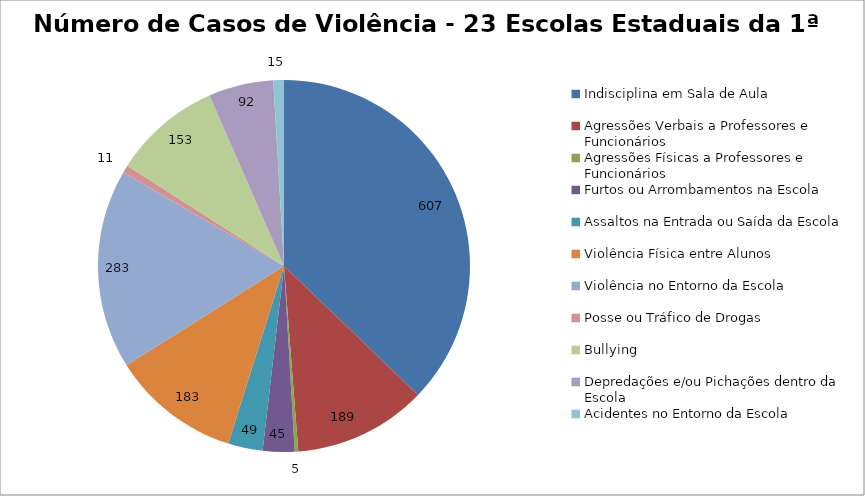
| Category | Número de Casos |
|---|---|
| Indisciplina em Sala de Aula | 607 |
| Agressões Verbais a Professores e Funcionários | 189 |
| Agressões Físicas a Professores e Funcionários | 5 |
| Furtos ou Arrombamentos na Escola | 45 |
| Assaltos na Entrada ou Saída da Escola | 49 |
| Violência Física entre Alunos | 183 |
| Violência no Entorno da Escola | 283 |
| Posse ou Tráfico de Drogas | 11 |
| Bullying | 153 |
| Depredações e/ou Pichações dentro da Escola | 92 |
| Acidentes no Entorno da Escola | 15 |